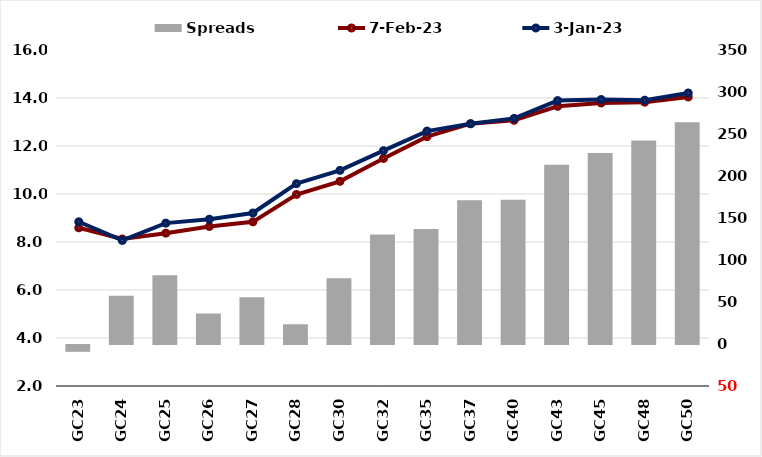
| Category |  Spreads   |
|---|---|
| GC23 | -8.135 |
| GC24 | 57.573 |
| GC25 | 81.902 |
| GC26 | 36.299 |
| GC27 | 55.562 |
| GC28 | 23.485 |
| GC30 | 78.291 |
| GC32 | 130.283 |
| GC35 | 136.983 |
| GC37 | 171.084 |
| GC40 | 171.58 |
| GC43 | 213.345 |
| GC45 | 227.406 |
| GC48 | 242.154 |
| GC50 | 263.871 |